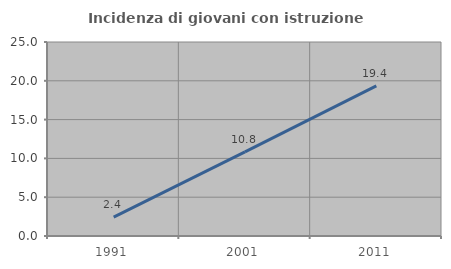
| Category | Incidenza di giovani con istruzione universitaria |
|---|---|
| 1991.0 | 2.439 |
| 2001.0 | 10.843 |
| 2011.0 | 19.355 |